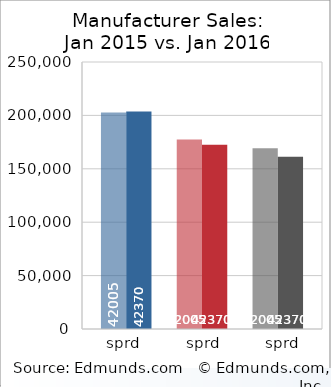
| Category | GM | Series 4 | Ford | Series 5 | Toyota |
|---|---|---|---|---|---|
| 0 | 203745 |  | 172478 |  | 161283 |